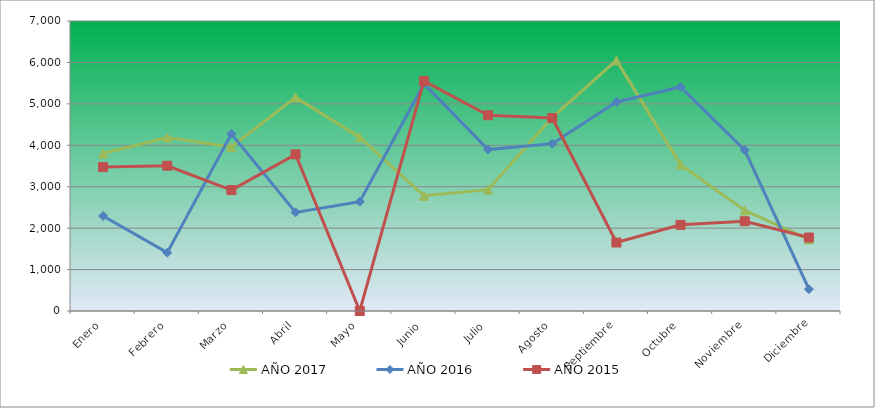
| Category | AÑO 2017 | AÑO 2016 | AÑO 2015 |
|---|---|---|---|
| Enero | 3801.184 | 2294.523 | 3474.171 |
| Febrero | 4184.973 | 1407.956 | 3506.65 |
| Marzo | 3961.591 | 4275.903 | 2918.196 |
| Abril | 5156.534 | 2380.927 | 3780.501 |
| Mayo | 4196.583 | 2638.986 | 0 |
| Junio | 2782.181 | 5485.36 | 5553.812 |
| Julio | 2929.155 | 3896.279 | 4725.72 |
| Agosto | 4672.858 | 4039.586 | 4658.809 |
| Septiembre | 6048.856 | 5045.025 | 1653.395 |
| Octubre | 3532.616 | 5408.43 | 2079.476 |
| Noviembre | 2429.172 | 3880.728 | 2165.909 |
| Diciembre | 1729.039 | 526.827 | 1773.715 |